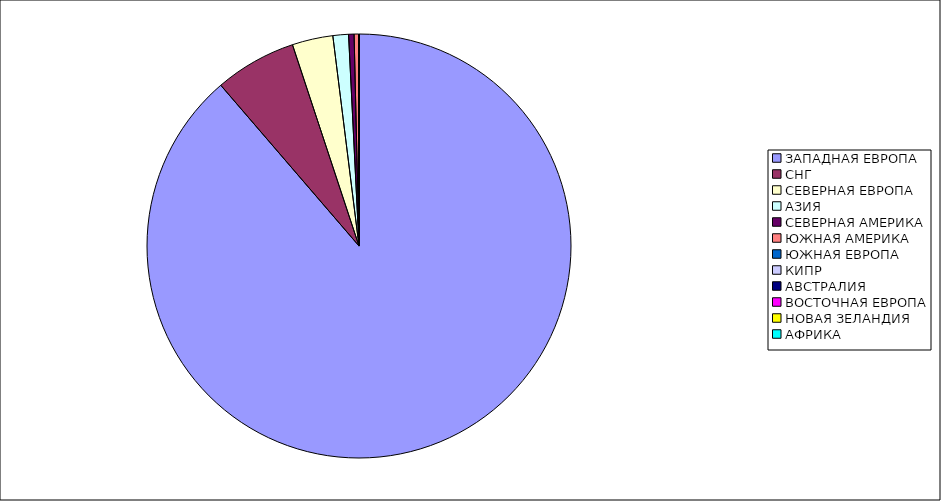
| Category | Оборот |
|---|---|
| ЗАПАДНАЯ ЕВРОПА | 0.887 |
| СНГ | 0.062 |
| СЕВЕРНАЯ ЕВРОПА | 0.031 |
| АЗИЯ | 0.012 |
| СЕВЕРНАЯ АМЕРИКА | 0.004 |
| ЮЖНАЯ АМЕРИКА | 0.003 |
| ЮЖНАЯ ЕВРОПА | 0 |
| КИПР | 0 |
| АВСТРАЛИЯ | 0 |
| ВОСТОЧНАЯ ЕВРОПА | 0 |
| НОВАЯ ЗЕЛАНДИЯ | 0 |
| АФРИКА | 0 |